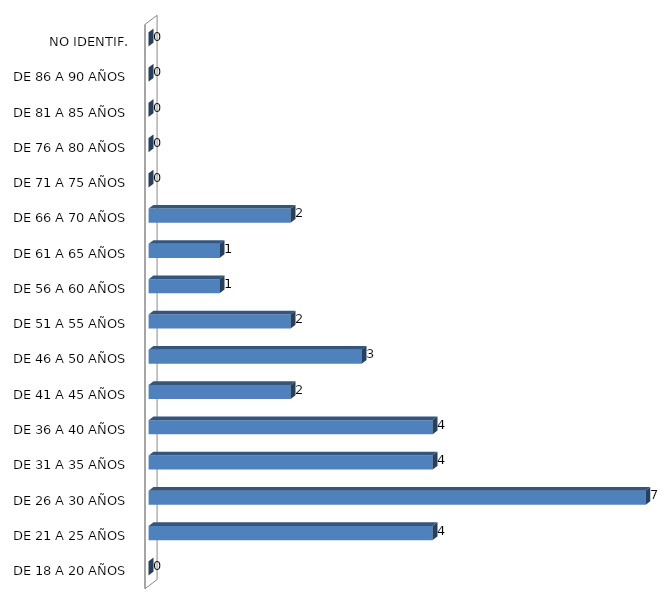
| Category | ESTADO  DE EBRIEDAD |
|---|---|
| DE 18 A 20 AÑOS | 0 |
| DE 21 A 25 AÑOS | 4 |
| DE 26 A 30 AÑOS | 7 |
| DE 31 A 35 AÑOS | 4 |
| DE 36 A 40 AÑOS | 4 |
| DE 41 A 45 AÑOS | 2 |
| DE 46 A 50 AÑOS | 3 |
| DE 51 A 55 AÑOS | 2 |
| DE 56 A 60 AÑOS | 1 |
| DE 61 A 65 AÑOS | 1 |
| DE 66 A 70 AÑOS | 2 |
| DE 71 A 75 AÑOS | 0 |
| DE 76 A 80 AÑOS | 0 |
| DE 81 A 85 AÑOS | 0 |
| DE 86 A 90 AÑOS | 0 |
| NO IDENTIF. | 0 |